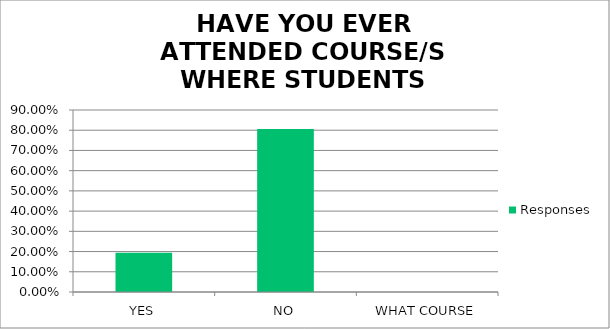
| Category | Responses |
|---|---|
| YES | 0.194 |
| NO | 0.806 |
| WHAT COURSE | 0 |